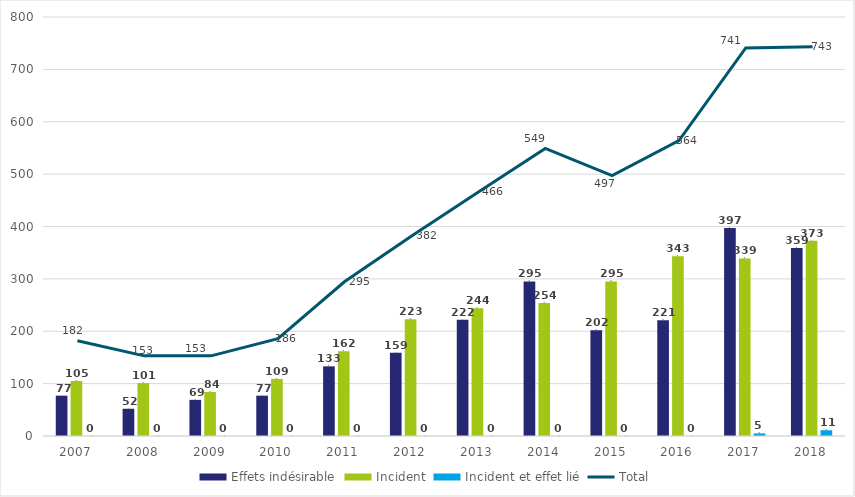
| Category | Effets indésirable | Incident | Incident et effet lié |
|---|---|---|---|
| 2007.0 | 77 | 105 | 0 |
| 2008.0 | 52 | 101 | 0 |
| 2009.0 | 69 | 84 | 0 |
| 2010.0 | 77 | 109 | 0 |
| 2011.0 | 133 | 162 | 0 |
| 2012.0 | 159 | 223 | 0 |
| 2013.0 | 222 | 244 | 0 |
| 2014.0 | 295 | 254 | 0 |
| 2015.0 | 202 | 295 | 0 |
| 2016.0 | 221 | 343 | 0 |
| 2017.0 | 397 | 339 | 5 |
| 2018.0 | 359 | 373 | 11 |